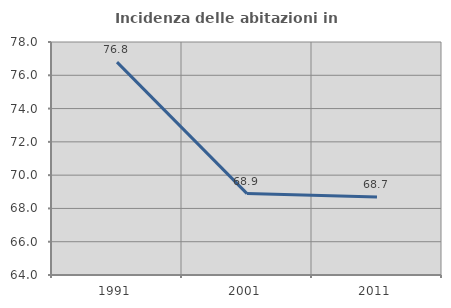
| Category | Incidenza delle abitazioni in proprietà  |
|---|---|
| 1991.0 | 76.793 |
| 2001.0 | 68.89 |
| 2011.0 | 68.682 |